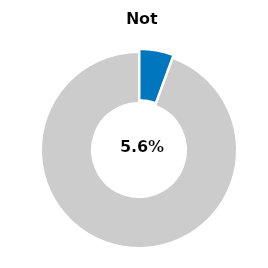
| Category | Series 0 |
|---|---|
| Not passed | 0.056 |
| Other | 0.944 |